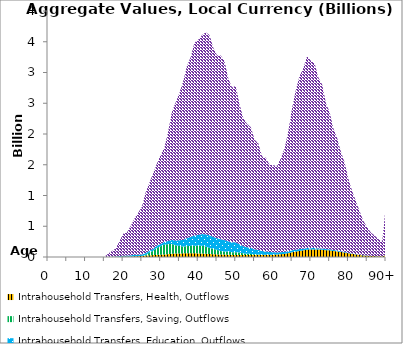
| Category | Intrahousehold Transfers, Health, Outflows | Intrahousehold Transfers, Saving, Outflows | Intrahousehold Transfers, Education, Outflows | Intrahousehold Transfers, Consumption other than health and education, Outflows |
|---|---|---|---|---|
| 0 | 0 | 0 | 0 | 0 |
|  | 0 | 0 | 0 | 0 |
| 2 | 0 | 0 | 0 | 0 |
| 3 | 0 | 0 | 0 | 0 |
| 4 | 0 | 0 | 0 | 0 |
| 5 | 0 | 0 | 0 | 0 |
| 6 | 0 | 0 | 0 | 0 |
| 7 | 0 | 0 | 0 | 0 |
| 8 | 0 | 0 | 0 | 0 |
| 9 | 0 | 0 | 0 | 0 |
| 10 | 0 | 0 | 0 | 0 |
| 11 | 0 | 0 | 0 | 0 |
| 12 | 0 | 0 | 0 | 0 |
| 13 | 0 | 0 | 0 | 0 |
| 14 | 0 | 0 | 0 | 0 |
| 15 | 0 | 0 | 0 | 0 |
| 16 | 0 | 0 | 0 | 54.761 |
| 17 | 1.838 | 0 | 3.461 | 90.266 |
| 18 | 3.23 | 0 | 6.629 | 129.124 |
| 19 | 4.761 | 0 | 10.115 | 240.409 |
| 20 | 7.06 | 0 | 14.728 | 356.036 |
| 21 | 6.758 | 0 | 15.895 | 376.972 |
| 22 | 8.444 | 0 | 19.527 | 473.887 |
| 23 | 11.056 | 0 | 23.123 | 589.521 |
| 24 | 13.667 | 0 | 23.97 | 679.263 |
| 25 | 16.517 | 0 | 25.037 | 776.277 |
| 26 | 22.688 | 12.651 | 28.598 | 983.938 |
| 27 | 27.332 | 44.089 | 29.751 | 1108.806 |
| 28 | 31.042 | 70.476 | 33.184 | 1225.421 |
| 29 | 34.462 | 115.061 | 35.82 | 1335.768 |
| 30 | 38.319 | 136.623 | 37.461 | 1449.118 |
| 31 | 40.606 | 162.166 | 42.396 | 1536.34 |
| 32 | 46.496 | 163.193 | 51.569 | 1780.414 |
| 33 | 54.146 | 157.201 | 65.286 | 2086.885 |
| 34 | 56.153 | 133.489 | 78.307 | 2246.235 |
| 35 | 57.456 | 122.446 | 93.262 | 2398.09 |
| 36 | 59.471 | 109.389 | 108.161 | 2581.47 |
| 37 | 60.714 | 115.669 | 131.52 | 2797.732 |
| 38 | 59.838 | 121.256 | 146.079 | 2925.367 |
| 39 | 60.87 | 122.152 | 165.764 | 3136.06 |
| 40 | 57.937 | 124.886 | 176.671 | 3172.703 |
| 41 | 55.813 | 129.012 | 188.055 | 3235.638 |
| 42 | 52.935 | 117.277 | 199.284 | 3283.865 |
| 43 | 48.44 | 99.11 | 205.882 | 3257.753 |
| 44 | 44.719 | 87.059 | 195.86 | 3076.915 |
| 45 | 42.198 | 75.275 | 189.599 | 2974.481 |
| 46 | 41.161 | 54.65 | 192.588 | 2987.323 |
| 47 | 40 | 49.188 | 187.096 | 2910.221 |
| 48 | 36.567 | 50.12 | 169.01 | 2648.666 |
| 49 | 33.509 | 45.173 | 159.208 | 2518.276 |
| 50 | 34.478 | 44.67 | 158.734 | 2543.746 |
| 51 | 32.273 | 40.287 | 135.2 | 2276.373 |
| 52 | 30.594 | 29.039 | 115.379 | 2083.216 |
| 53 | 30.744 | 21.86 | 105.689 | 2005.153 |
| 54 | 32.167 | 18.078 | 98.523 | 1962.233 |
| 55 | 32.079 | 11.297 | 80.687 | 1783.404 |
| 56 | 32.525 | 8.757 | 74.89 | 1731.142 |
| 57 | 31.318 | 5.44 | 60.515 | 1538.881 |
| 58 | 34.394 | 3.738 | 52.944 | 1522.935 |
| 59 | 34.916 | 1.823 | 44.013 | 1415.97 |
| 60 | 37.103 | 0.787 | 39.695 | 1414.224 |
| 61 | 39.863 | 0.816 | 33.591 | 1409.382 |
| 62 | 45.162 | 0.766 | 32.401 | 1531.709 |
| 63 | 51.548 | 0.156 | 31.706 | 1682.011 |
| 64 | 62.82 | 0.166 | 31.301 | 1951.62 |
| 65 | 77.162 | 0.173 | 32.05 | 2316.245 |
| 66 | 88.77 | 0.171 | 31.673 | 2598.183 |
| 67 | 98.461 | 0.166 | 30.436 | 2818.138 |
| 68 | 108.636 | 0 | 24.933 | 2939.001 |
| 69 | 119.682 | 0 | 24.759 | 3120.578 |
| 70 | 120.517 | 0 | 23.448 | 3047.106 |
| 71 | 123.037 | 0 | 22.321 | 3000.583 |
| 72 | 121.122 | 0 | 17.972 | 2778.627 |
| 73 | 119.271 | 0 | 20.977 | 2663.197 |
| 74 | 111.013 | 0 | 17.461 | 2372.981 |
| 75 | 108.89 | 0 | 16.322 | 2228.974 |
| 76 | 98.532 | 0 | 15.146 | 1974.998 |
| 77 | 91.688 | 0 | 14.27 | 1826.401 |
| 78 | 81.725 | 0 | 11.416 | 1618.097 |
| 79 | 73.247 | 0 | 9.944 | 1449.038 |
| 80 | 60.73 | 0 | 6.861 | 1201.614 |
| 81 | 51.391 | 0 | 4.536 | 1015.508 |
| 82 | 41.567 | 0 | 5.371 | 859.07 |
| 83 | 33.35 | 0 | 4.275 | 703.702 |
| 84 | 24.905 | 0 | 4.299 | 553.857 |
| 85 | 20.019 | 0 | 3.692 | 459.118 |
| 86 | 16.056 | 0 | 3.269 | 375.473 |
| 87 | 14.194 | 0 | 1.815 | 331.883 |
| 88 | 11.441 | 0 | 1.608 | 276.025 |
| 89 | 10.025 | 0 | 1.071 | 244.776 |
| 90+ | 33.543 | 0 | 2.554 | 827.899 |